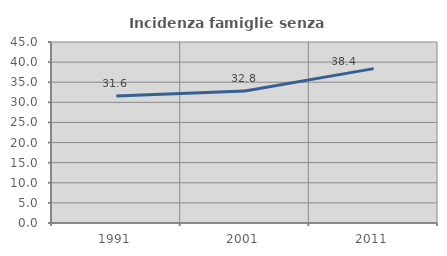
| Category | Incidenza famiglie senza nuclei |
|---|---|
| 1991.0 | 31.591 |
| 2001.0 | 32.812 |
| 2011.0 | 38.381 |